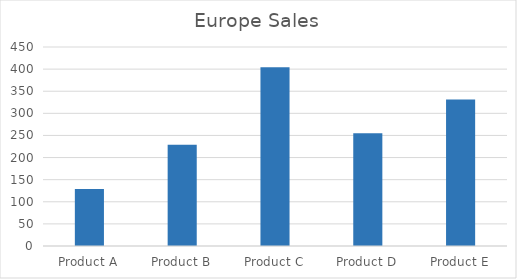
| Category | This Week |
|---|---|
| Product A | 129 |
| Product B | 229 |
| Product C | 404 |
| Product D | 255 |
| Product E | 331 |